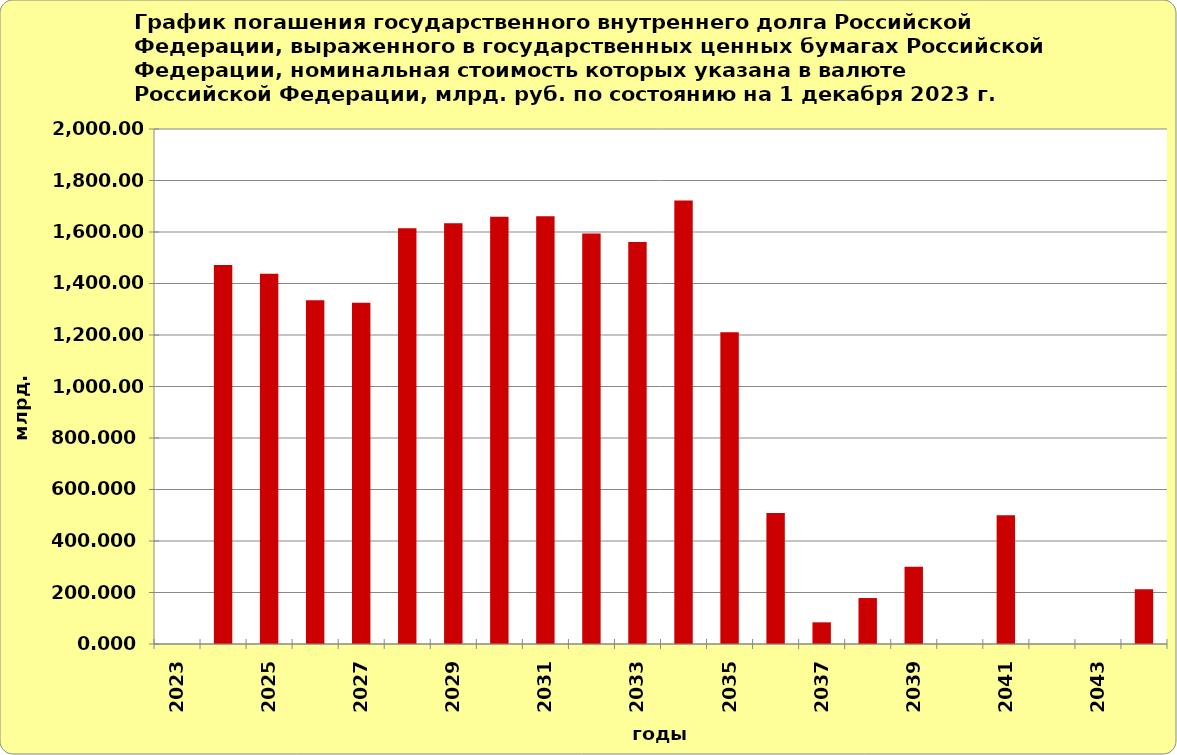
| Category | Series 1 |
|---|---|
| 2023.0 | 0 |
| 2024.0 | 1471.862 |
| 2025.0 | 1437.652 |
| 2026.0 | 1334.561 |
| 2027.0 | 1324.833 |
| 2028.0 | 1614.816 |
| 2029.0 | 1633.774 |
| 2030.0 | 1659.17 |
| 2031.0 | 1661.564 |
| 2032.0 | 1594.347 |
| 2033.0 | 1560.699 |
| 2034.0 | 1722.648 |
| 2035.0 | 1210.91 |
| 2036.0 | 508.553 |
| 2037.0 | 84.139 |
| 2038.0 | 178.498 |
| 2039.0 | 300 |
| 2040.0 | 0 |
| 2041.0 | 500 |
| 2042.0 | 0 |
| 2043.0 | 0 |
| 2044.0 | 212.636 |